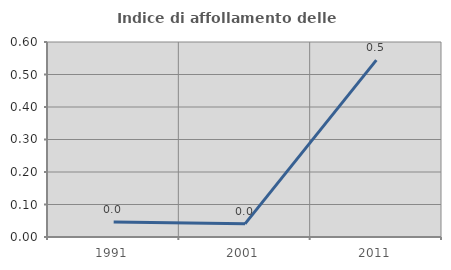
| Category | Indice di affollamento delle abitazioni  |
|---|---|
| 1991.0 | 0.046 |
| 2001.0 | 0.04 |
| 2011.0 | 0.544 |